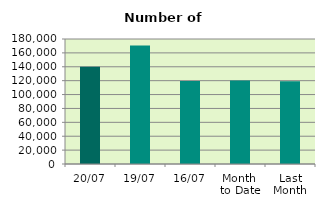
| Category | Series 0 |
|---|---|
| 20/07 | 140154 |
| 19/07 | 170688 |
| 16/07 | 119444 |
| Month 
to Date | 120318.143 |
| Last
Month | 119107.818 |